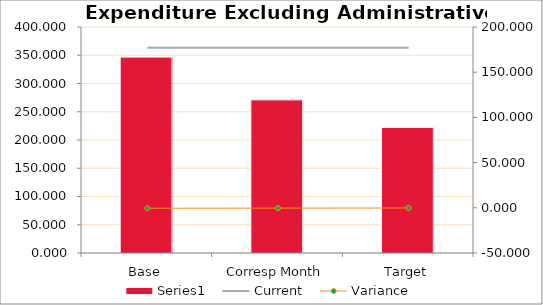
| Category | Series 0 |
|---|---|
| Base | 346.73 |
| Corresp Month | 271.056 |
| Target | 222.144 |